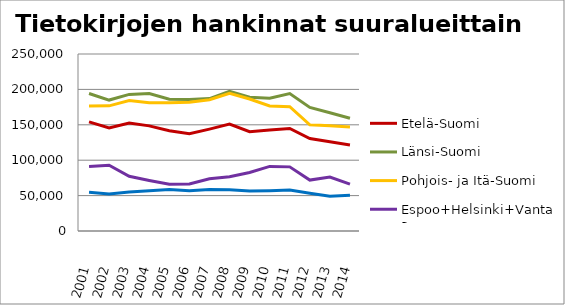
| Category | Etelä-Suomi | Länsi-Suomi | Pohjois- ja Itä-Suomi | Espoo+Helsinki+Vantaa | Muu Uusimaa |
|---|---|---|---|---|---|
| 2001.0 | 154177 | 194258 | 176716 | 90931 | 54657 |
| 2002.0 | 145537 | 184936 | 176794 | 92884 | 52151 |
| 2003.0 | 152596 | 192971 | 184353 | 77252 | 54981 |
| 2004.0 | 148491 | 194124 | 181102 | 71400 | 57016 |
| 2005.0 | 141697 | 186148 | 180978 | 65941 | 58747 |
| 2006.0 | 137310 | 185600 | 181830 | 66289 | 56983 |
| 2007.0 | 143935 | 187085 | 185363 | 73671 | 58463 |
| 2008.0 | 151119 | 197155 | 194422 | 76517 | 58203 |
| 2009.0 | 140229 | 188848 | 186498 | 82637 | 56380 |
| 2010.0 | 142586 | 187636 | 176603 | 91245 | 56911 |
| 2011.0 | 144896 | 194117 | 175516 | 90581 | 57765 |
| 2012.0 | 130678 | 174537 | 150072 | 71935 | 53388 |
| 2013.0 | 126115 | 167090 | 148511 | 76216 | 49183 |
| 2014.0 | 121597 | 159288 | 146874 | 66278 | 50390 |